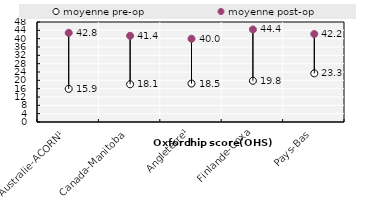
| Category | moyenne pre-op | moyenne post-op |
|---|---|---|
| Australie-ACORN¹ | 15.9 | 42.8 |
| Canada-Manitoba | 18.09 | 41.39 |
| Angleterre¹ | 18.462 | 39.956 |
| Finlande-Coxa | 19.79 | 44.41 |
| Pays-Bas | 23.336 | 42.22 |